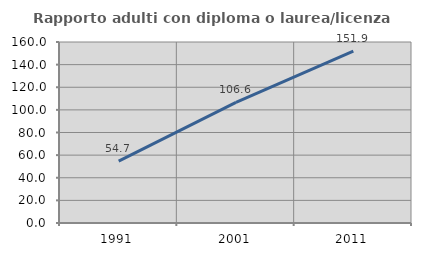
| Category | Rapporto adulti con diploma o laurea/licenza media  |
|---|---|
| 1991.0 | 54.707 |
| 2001.0 | 106.596 |
| 2011.0 | 151.946 |